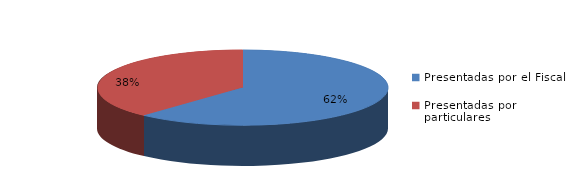
| Category | Series 0 |
|---|---|
| Presentadas por el Fiscal | 196 |
| Presentadas por particulares | 121 |